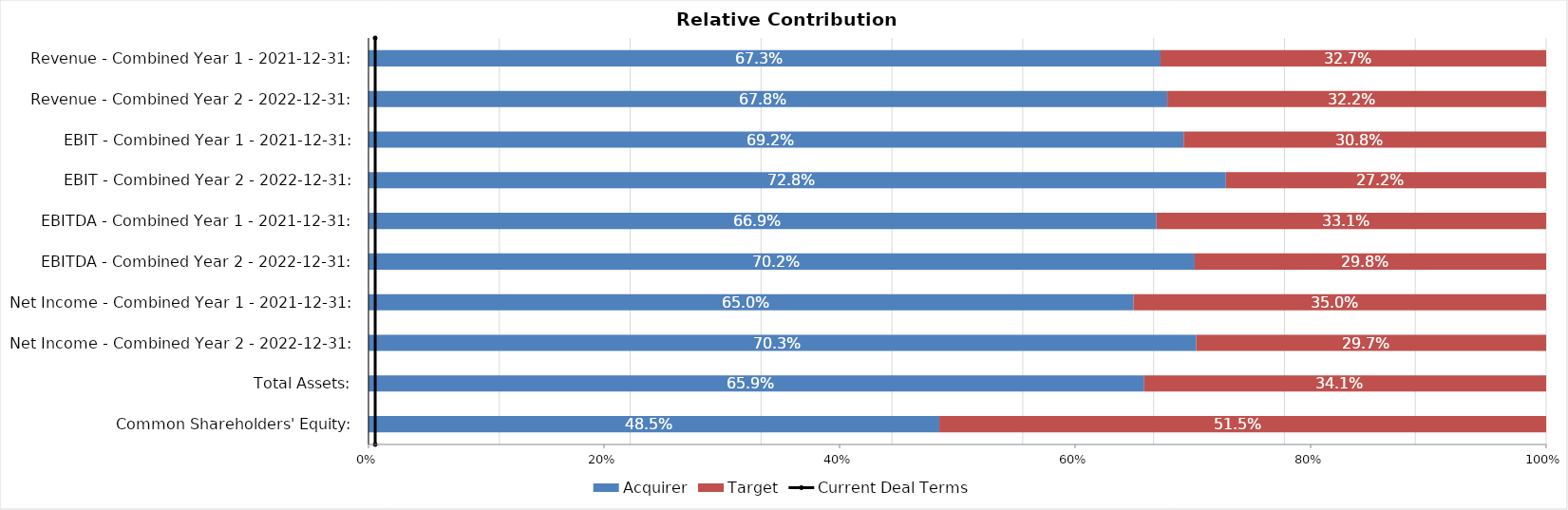
| Category | Acquirer | Target |
|---|---|---|
| Common Shareholders' Equity: | 0.485 | 0.515 |
| Total Assets: | 0.659 | 0.341 |
| Net Income - Combined Year 2 - 2022-12-31: | 0.703 | 0.297 |
| Net Income - Combined Year 1 - 2021-12-31: | 0.65 | 0.35 |
| EBITDA - Combined Year 2 - 2022-12-31: | 0.702 | 0.298 |
| EBITDA - Combined Year 1 - 2021-12-31: | 0.669 | 0.331 |
| EBIT - Combined Year 2 - 2022-12-31: | 0.728 | 0.272 |
| EBIT - Combined Year 1 - 2021-12-31: | 0.692 | 0.308 |
| Revenue - Combined Year 2 - 2022-12-31: | 0.678 | 0.322 |
| Revenue - Combined Year 1 - 2021-12-31: | 0.673 | 0.327 |